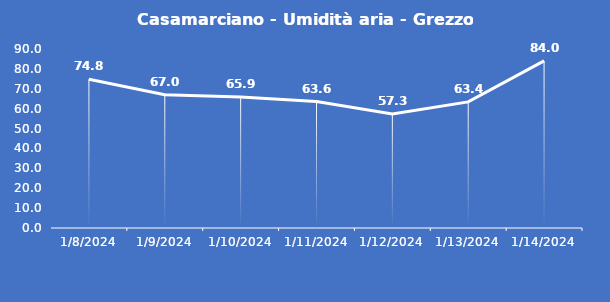
| Category | Casamarciano - Umidità aria - Grezzo (%) |
|---|---|
| 1/8/24 | 74.8 |
| 1/9/24 | 67 |
| 1/10/24 | 65.9 |
| 1/11/24 | 63.6 |
| 1/12/24 | 57.3 |
| 1/13/24 | 63.4 |
| 1/14/24 | 84 |